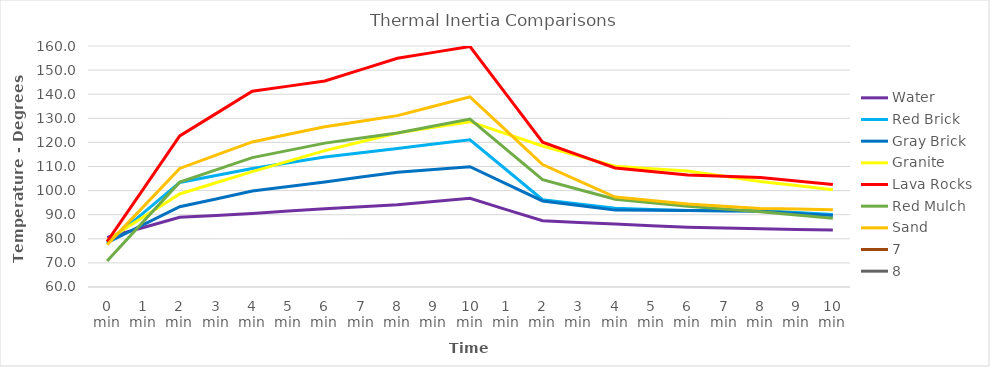
| Category | Water | Red Brick | Gray Brick | Granite | Lava Rocks | Red Mulch | Sand | 7 | 8 |
|---|---|---|---|---|---|---|---|---|---|
| 0 min | 80.6 | 78.1 | 78.4 | 79.5 | 78.8 | 70.8 | 77.5 |  |  |
| 1 min | 84.7 | 90.75 | 85.85 | 89.05 | 100.75 | 87.15 | 93.35 |  |  |
| 2 min | 88.9 | 103.4 | 93.3 | 98.6 | 122.7 | 103.5 | 109.2 |  |  |
| 3 min | 89.7 | 106.3 | 96.55 | 103.25 | 131.95 | 108.6 | 114.7 |  |  |
| 4 min | 90.5 | 109.2 | 99.8 | 107.9 | 141.2 | 113.7 | 120.2 |  |  |
| 5 min | 91.5 | 111.55 | 101.7 | 112.25 | 143.35 | 116.7 | 123.35 |  |  |
| 6 min | 92.5 | 113.9 | 103.6 | 116.6 | 145.5 | 119.7 | 126.5 |  |  |
| 7 min | 93.3 | 115.7 | 105.6 | 120.25 | 150.2 | 121.8 | 128.8 |  |  |
| 8 min | 94.1 | 117.5 | 107.6 | 123.9 | 154.9 | 123.9 | 131.1 |  |  |
| 9 min | 95.5 | 119.3 | 108.75 | 126.25 | 157.35 | 126.8 | 135 |  |  |
| 10 min | 96.8 | 121.1 | 109.9 | 128.6 | 159.8 | 129.7 | 138.9 |  |  |
| 1 min | 92.1 | 108.65 | 102.8 | 123.55 | 139.95 | 117.1 | 124.85 |  |  |
| 2 min | 87.5 | 96.2 | 95.7 | 118.5 | 120.1 | 104.5 | 110.8 |  |  |
| 3 min | 86.8 | 94.45 | 93.8 | 114.3 | 114.75 | 100.45 | 104.05 |  |  |
| 4 min | 86.1 | 92.7 | 91.9 | 110.1 | 109.4 | 96.4 | 97.3 |  |  |
| 5 min | 85.4 | 92.2 | 91.8 | 109.1 | 107.95 | 94.95 | 95.85 |  |  |
| 6 min | 84.8 | 91.7 | 91.7 | 108.1 | 106.5 | 93.5 | 94.4 |  |  |
| 7 min | 84.5 | 91.7 | 91.55 | 105.95 | 105.95 | 92.35 | 93.5 |  |  |
| 8 min | 84.2 | 91.7 | 91.4 | 103.8 | 105.4 | 91.2 | 92.6 |  |  |
| 9 min | 83.9 | 90.9 | 90.55 | 102.1 | 103.95 | 89.85 | 92.35 |  |  |
| 10 min | 83.7 | 90.1 | 89.7 | 100.4 | 102.5 | 88.5 | 92.1 |  |  |